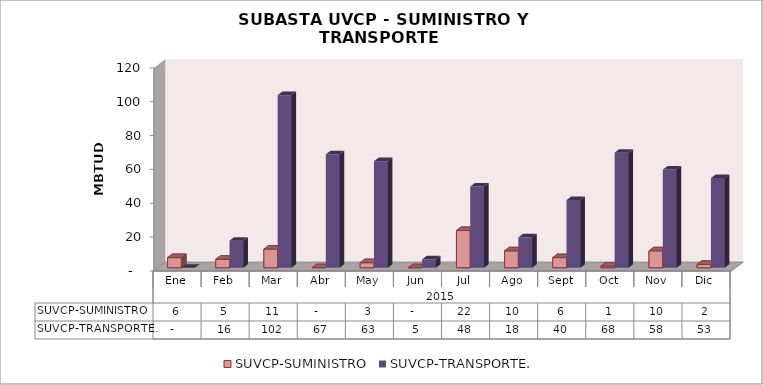
| Category | SUVCP-SUMINISTRO | SUVCP-TRANSPORTE. |
|---|---|---|
| 0 | 6 | 0 |
| 1 | 5 | 16 |
| 2 | 11 | 102 |
| 3 | 0 | 67 |
| 4 | 3 | 63 |
| 5 | 0 | 5 |
| 6 | 22 | 48 |
| 7 | 10 | 18 |
| 8 | 6 | 40 |
| 9 | 1 | 68 |
| 10 | 10 | 58 |
| 11 | 2 | 53 |